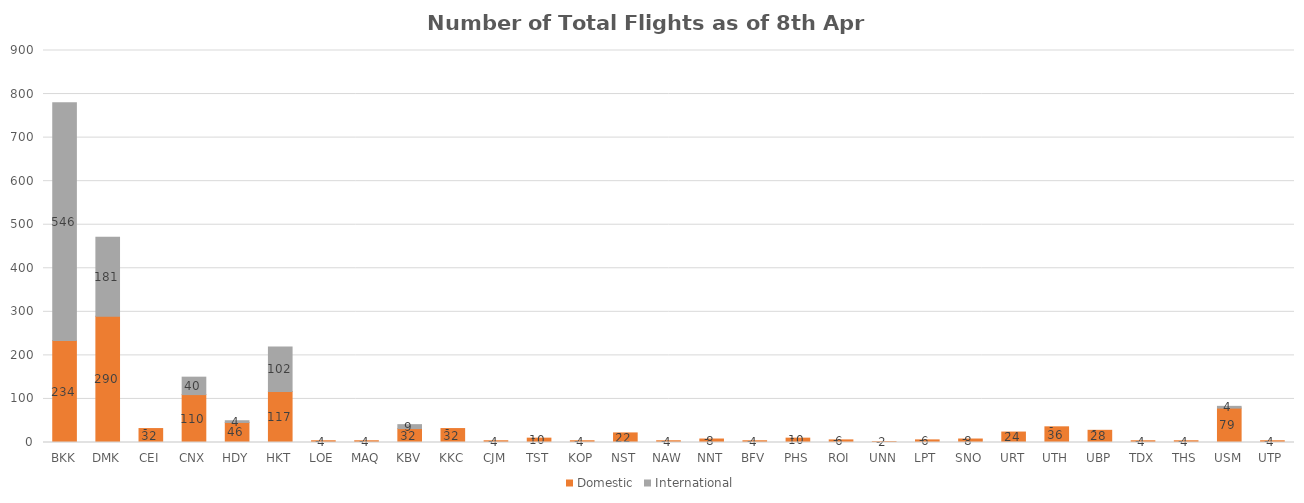
| Category | Domestic | International |
|---|---|---|
| BKK | 234 | 546 |
| DMK | 290 | 181 |
| CEI | 32 | 0 |
| CNX | 110 | 40 |
| HDY | 46 | 4 |
| HKT | 117 | 102 |
| LOE | 4 | 0 |
| MAQ | 4 | 0 |
| KBV | 32 | 9 |
| KKC | 32 | 0 |
| CJM | 4 | 0 |
| TST | 10 | 0 |
| KOP | 4 | 0 |
| NST | 22 | 0 |
| NAW | 4 | 0 |
| NNT | 8 | 0 |
| BFV | 4 | 0 |
| PHS | 10 | 0 |
| ROI | 6 | 0 |
| UNN | 2 | 0 |
| LPT | 6 | 0 |
| SNO | 8 | 0 |
| URT | 24 | 0 |
| UTH | 36 | 0 |
| UBP | 28 | 0 |
| TDX | 4 | 0 |
| THS | 4 | 0 |
| USM | 79 | 4 |
| UTP | 4 | 0 |